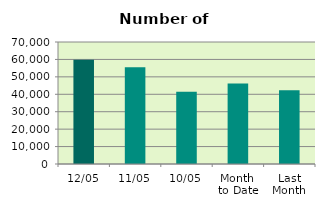
| Category | Series 0 |
|---|---|
| 12/05 | 59856 |
| 11/05 | 55514 |
| 10/05 | 41496 |
| Month 
to Date | 46230.75 |
| Last
Month | 42252.3 |